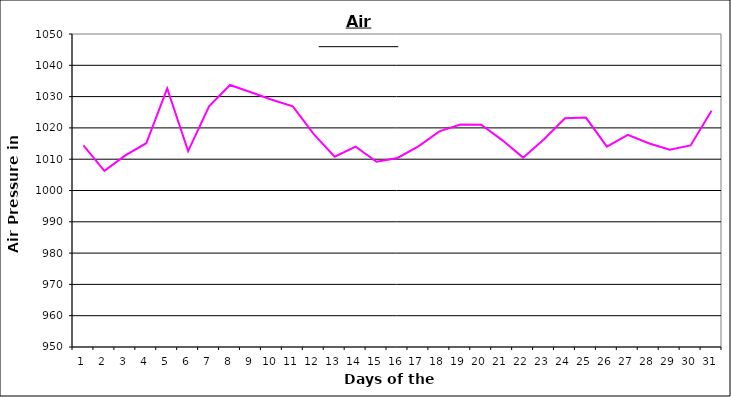
| Category | Series 0 |
|---|---|
| 0 | 1014.4 |
| 1 | 1006.3 |
| 2 | 1011.2 |
| 3 | 1015.1 |
| 4 | 1032.6 |
| 5 | 1012.6 |
| 6 | 1026.9 |
| 7 | 1033.7 |
| 8 | 1031.4 |
| 9 | 1029 |
| 10 | 1026.9 |
| 11 | 1018 |
| 12 | 1010.8 |
| 13 | 1014 |
| 14 | 1009.2 |
| 15 | 1010.4 |
| 16 | 1014.1 |
| 17 | 1018.9 |
| 18 | 1021.1 |
| 19 | 1021 |
| 20 | 1016.1 |
| 21 | 1010.5 |
| 22 | 1016.4 |
| 23 | 1023.1 |
| 24 | 1023.3 |
| 25 | 1014 |
| 26 | 1017.8 |
| 27 | 1015.1 |
| 28 | 1013 |
| 29 | 1014.4 |
| 30 | 1025.5 |